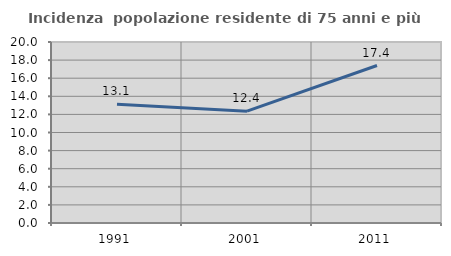
| Category | Incidenza  popolazione residente di 75 anni e più |
|---|---|
| 1991.0 | 13.115 |
| 2001.0 | 12.357 |
| 2011.0 | 17.4 |